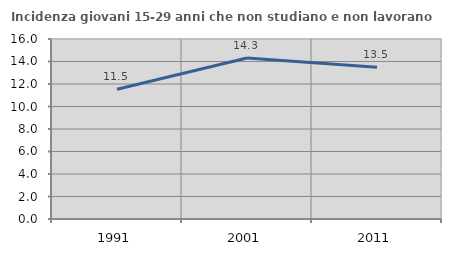
| Category | Incidenza giovani 15-29 anni che non studiano e non lavorano  |
|---|---|
| 1991.0 | 11.538 |
| 2001.0 | 14.31 |
| 2011.0 | 13.496 |